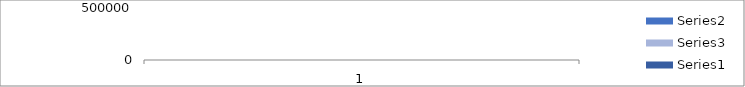
| Category | Series 1 | Series 2 | Series 0 |
|---|---|---|---|
| 0 | 1 | 1 | 1 |